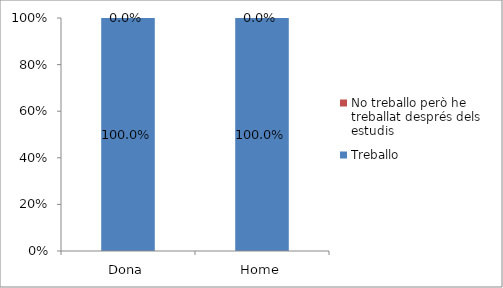
| Category | Treballo | No treballo però he treballat després dels estudis |
|---|---|---|
| Dona | 1 | 0 |
| Home | 1 | 0 |